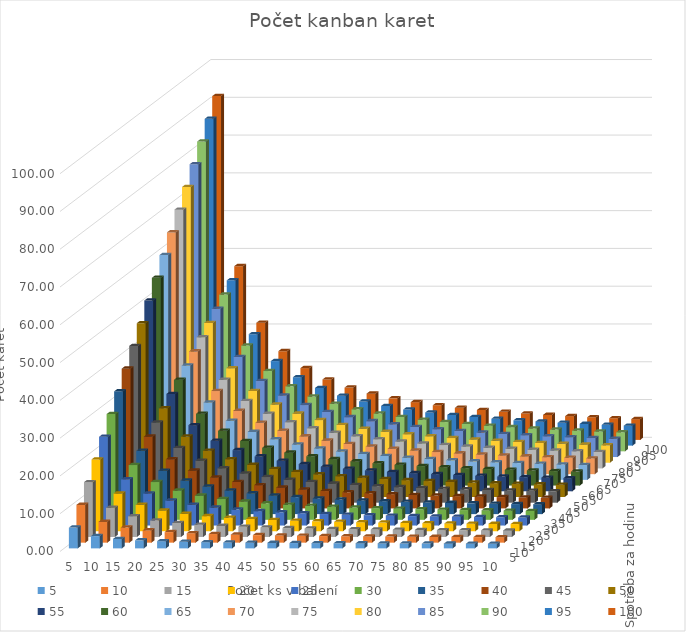
| Category | 5 | 10 | 15 | 20 | 25 | 30 | 35 | 40 | 45 | 50 | 55 | 60 | 65 | 70 | 75 | 80 | 85 | 90 | 95 | 100 |
|---|---|---|---|---|---|---|---|---|---|---|---|---|---|---|---|---|---|---|---|---|
| 5.0 | 5.5 | 10 | 14.5 | 19 | 23.5 | 28 | 32.5 | 37 | 41.5 | 46 | 50.5 | 55 | 59.5 | 64 | 68.5 | 73 | 77.5 | 82 | 86.5 | 91 |
| 10.0 | 3.25 | 5.5 | 7.75 | 10 | 12.25 | 14.5 | 16.75 | 19 | 21.25 | 23.5 | 25.75 | 28 | 30.25 | 32.5 | 34.75 | 37 | 39.25 | 41.5 | 43.75 | 46 |
| 15.0 | 2.5 | 4 | 5.5 | 7 | 8.5 | 10 | 11.5 | 13 | 14.5 | 16 | 17.5 | 19 | 20.5 | 22 | 23.5 | 25 | 26.5 | 28 | 29.5 | 31 |
| 20.0 | 2.125 | 3.25 | 4.375 | 5.5 | 6.625 | 7.75 | 8.875 | 10 | 11.125 | 12.25 | 13.375 | 14.5 | 15.625 | 16.75 | 17.875 | 19 | 20.125 | 21.25 | 22.375 | 23.5 |
| 25.0 | 1.9 | 2.8 | 3.7 | 4.6 | 5.5 | 6.4 | 7.3 | 8.2 | 9.1 | 10 | 10.9 | 11.8 | 12.7 | 13.6 | 14.5 | 15.4 | 16.3 | 17.2 | 18.1 | 19 |
| 30.0 | 1.75 | 2.5 | 3.25 | 4 | 4.75 | 5.5 | 6.25 | 7 | 7.75 | 8.5 | 9.25 | 10 | 10.75 | 11.5 | 12.25 | 13 | 13.75 | 14.5 | 15.25 | 16 |
| 35.0 | 1.643 | 2.286 | 2.929 | 3.571 | 4.214 | 4.857 | 5.5 | 6.143 | 6.786 | 7.429 | 8.071 | 8.714 | 9.357 | 10 | 10.643 | 11.286 | 11.929 | 12.571 | 13.214 | 13.857 |
| 40.0 | 1.562 | 2.125 | 2.687 | 3.25 | 3.812 | 4.375 | 4.937 | 5.5 | 6.063 | 6.625 | 7.188 | 7.75 | 8.312 | 8.875 | 9.438 | 10 | 10.562 | 11.125 | 11.687 | 12.25 |
| 45.0 | 1.5 | 2 | 2.5 | 3 | 3.5 | 4 | 4.5 | 5 | 5.5 | 6 | 6.5 | 7 | 7.5 | 8 | 8.5 | 9 | 9.5 | 10 | 10.5 | 11 |
| 50.0 | 1.45 | 1.9 | 2.35 | 2.8 | 3.25 | 3.7 | 4.15 | 4.6 | 5.05 | 5.5 | 5.95 | 6.4 | 6.85 | 7.3 | 7.75 | 8.2 | 8.65 | 9.1 | 9.55 | 10 |
| 55.0 | 1.409 | 1.818 | 2.227 | 2.636 | 3.045 | 3.455 | 3.864 | 4.273 | 4.682 | 5.091 | 5.5 | 5.909 | 6.318 | 6.727 | 7.136 | 7.545 | 7.955 | 8.364 | 8.773 | 9.182 |
| 60.0 | 1.375 | 1.75 | 2.125 | 2.5 | 2.875 | 3.25 | 3.625 | 4 | 4.375 | 4.75 | 5.125 | 5.5 | 5.875 | 6.25 | 6.625 | 7 | 7.375 | 7.75 | 8.125 | 8.5 |
| 65.0 | 1.346 | 1.692 | 2.038 | 2.385 | 2.731 | 3.077 | 3.423 | 3.769 | 4.115 | 4.462 | 4.808 | 5.154 | 5.5 | 5.846 | 6.192 | 6.538 | 6.885 | 7.231 | 7.577 | 7.923 |
| 70.0 | 1.321 | 1.643 | 1.964 | 2.286 | 2.607 | 2.929 | 3.25 | 3.571 | 3.893 | 4.214 | 4.536 | 4.857 | 5.179 | 5.5 | 5.821 | 6.143 | 6.464 | 6.786 | 7.107 | 7.429 |
| 75.0 | 1.3 | 1.6 | 1.9 | 2.2 | 2.5 | 2.8 | 3.1 | 3.4 | 3.7 | 4 | 4.3 | 4.6 | 4.9 | 5.2 | 5.5 | 5.8 | 6.1 | 6.4 | 6.7 | 7 |
| 80.0 | 1.281 | 1.562 | 1.844 | 2.125 | 2.406 | 2.687 | 2.969 | 3.25 | 3.531 | 3.812 | 4.094 | 4.375 | 4.656 | 4.937 | 5.219 | 5.5 | 5.781 | 6.063 | 6.344 | 6.625 |
| 85.0 | 1.265 | 1.529 | 1.794 | 2.059 | 2.324 | 2.588 | 2.853 | 3.118 | 3.382 | 3.647 | 3.912 | 4.176 | 4.441 | 4.706 | 4.971 | 5.235 | 5.5 | 5.765 | 6.029 | 6.294 |
| 90.0 | 1.25 | 1.5 | 1.75 | 2 | 2.25 | 2.5 | 2.75 | 3 | 3.25 | 3.5 | 3.75 | 4 | 4.25 | 4.5 | 4.75 | 5 | 5.25 | 5.5 | 5.75 | 6 |
| 95.0 | 1.237 | 1.474 | 1.711 | 1.947 | 2.184 | 2.421 | 2.658 | 2.895 | 3.132 | 3.368 | 3.605 | 3.842 | 4.079 | 4.316 | 4.553 | 4.789 | 5.026 | 5.263 | 5.5 | 5.737 |
| 100.0 | 1.225 | 1.45 | 1.675 | 1.9 | 2.125 | 2.35 | 2.575 | 2.8 | 3.025 | 3.25 | 3.475 | 3.7 | 3.925 | 4.15 | 4.375 | 4.6 | 4.825 | 5.05 | 5.275 | 5.5 |